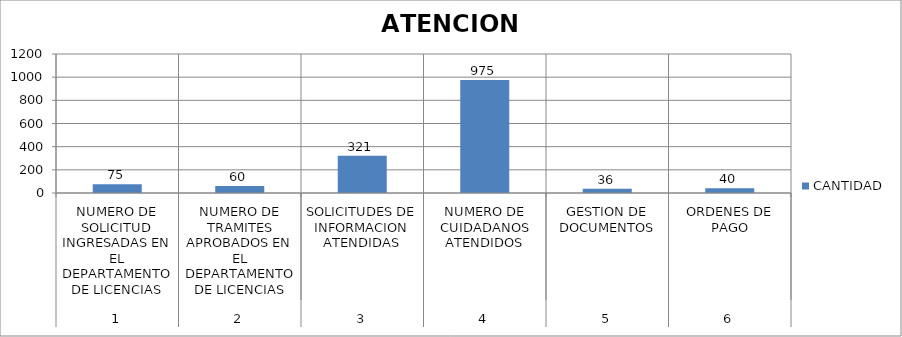
| Category | CANTIDAD |
|---|---|
| 0 | 75 |
| 1 | 60 |
| 2 | 321 |
| 3 | 975 |
| 4 | 36 |
| 5 | 40 |